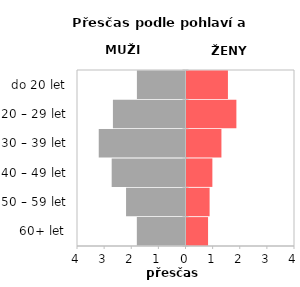
| Category | Přesčas |
|---|---|
| 60+ let | 0.795 |
| 50 – 59 let | 0.852 |
| 40 – 49 let | 0.954 |
| 30 – 39 let | 1.288 |
| 20 – 29 let | 1.839 |
| do 20 let | 1.528 |